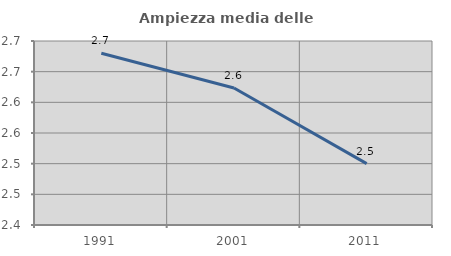
| Category | Ampiezza media delle famiglie |
|---|---|
| 1991.0 | 2.68 |
| 2001.0 | 2.623 |
| 2011.0 | 2.5 |